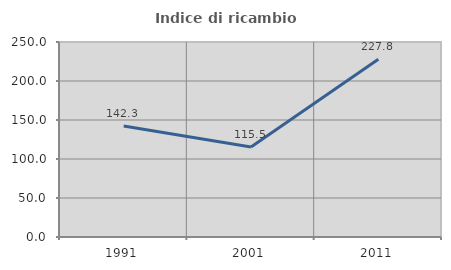
| Category | Indice di ricambio occupazionale  |
|---|---|
| 1991.0 | 142.254 |
| 2001.0 | 115.517 |
| 2011.0 | 227.778 |